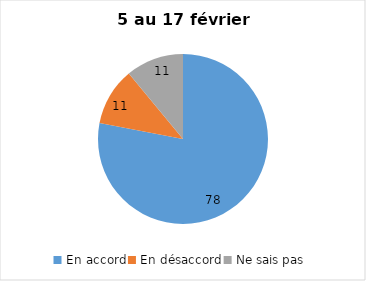
| Category | Series 0 |
|---|---|
| En accord | 78 |
| En désaccord | 11 |
| Ne sais pas | 11 |